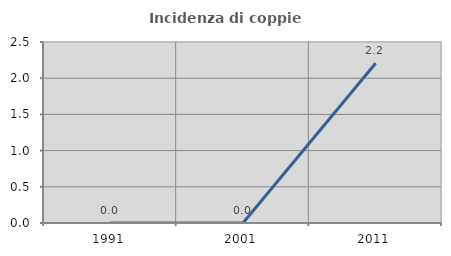
| Category | Incidenza di coppie miste |
|---|---|
| 1991.0 | 0 |
| 2001.0 | 0 |
| 2011.0 | 2.206 |